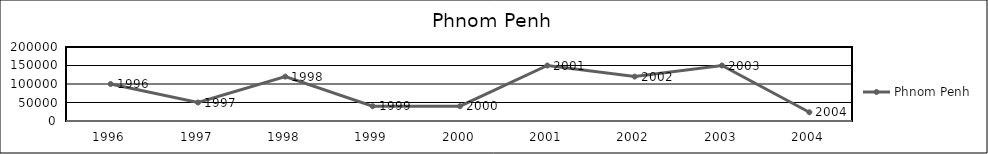
| Category | Phnom Penh |
|---|---|
| 1996.0 | 100000 |
| 1997.0 | 50000 |
| 1998.0 | 120000 |
| 1999.0 | 40000 |
| 2000.0 | 40000 |
| 2001.0 | 150000 |
| 2002.0 | 120000 |
| 2003.0 | 150000 |
| 2004.0 | 23600 |